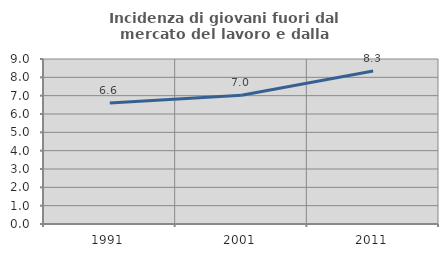
| Category | Incidenza di giovani fuori dal mercato del lavoro e dalla formazione  |
|---|---|
| 1991.0 | 6.597 |
| 2001.0 | 7.026 |
| 2011.0 | 8.342 |